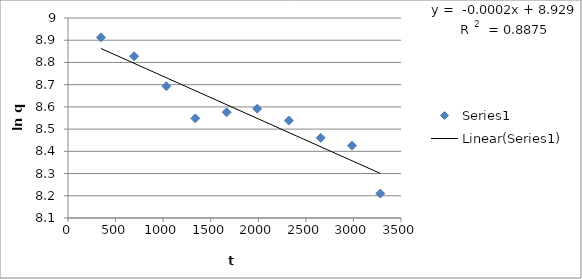
| Category | Series 0 |
|---|---|
| 346.55 | 8.913 |
| 694.585 | 8.828 |
| 1033.3 | 8.693 |
| 1338.28 | 8.548 |
| 1667.55 | 8.576 |
| 1988.98 | 8.592 |
| 2321.17 | 8.538 |
| 2655.93 | 8.461 |
| 2985.11 | 8.425 |
| 3282.505 | 8.21 |